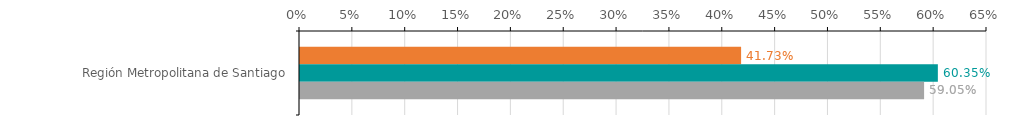
| Category | Numero de operaciones | Monto ($ MM) | Garantia ($ MM) |
|---|---|---|---|
| Región Metropolitana de Santiago | 0.417 | 0.604 | 0.59 |